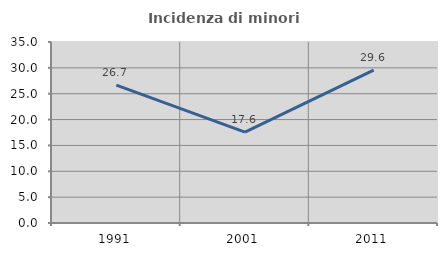
| Category | Incidenza di minori stranieri |
|---|---|
| 1991.0 | 26.667 |
| 2001.0 | 17.568 |
| 2011.0 | 29.56 |